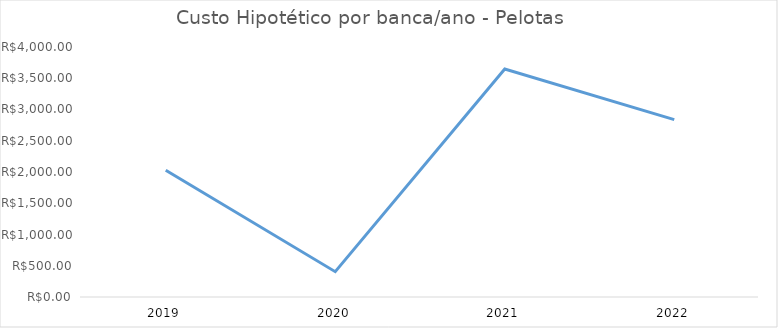
| Category | Series 0 |
|---|---|
| 2019.0 | 2026.95 |
| 2020.0 | 405.39 |
| 2021.0 | 3648.51 |
| 2022.0 | 2837.73 |